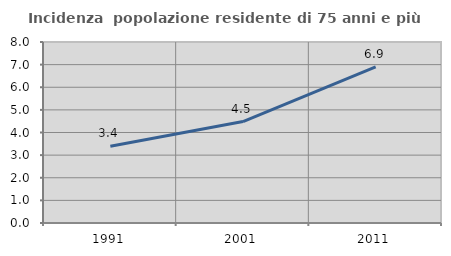
| Category | Incidenza  popolazione residente di 75 anni e più |
|---|---|
| 1991.0 | 3.396 |
| 2001.0 | 4.484 |
| 2011.0 | 6.905 |